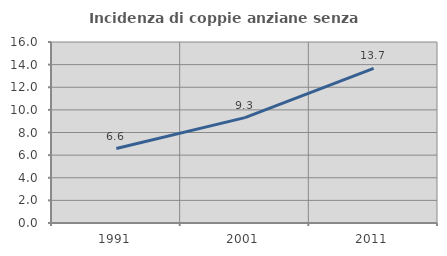
| Category | Incidenza di coppie anziane senza figli  |
|---|---|
| 1991.0 | 6.585 |
| 2001.0 | 9.316 |
| 2011.0 | 13.675 |